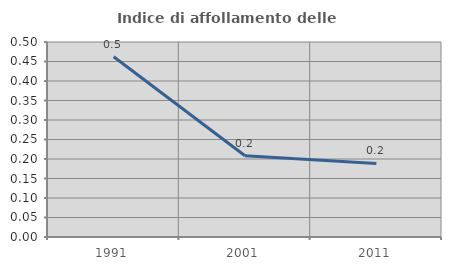
| Category | Indice di affollamento delle abitazioni  |
|---|---|
| 1991.0 | 0.462 |
| 2001.0 | 0.208 |
| 2011.0 | 0.189 |